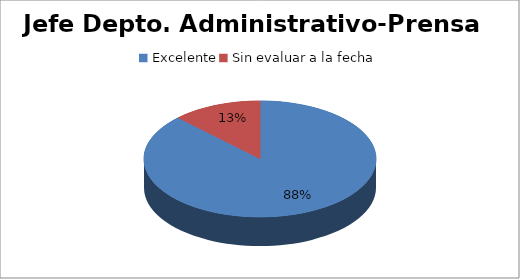
| Category | Cantidad |
|---|---|
| Excelente | 7 |
| Sin evaluar a la fecha | 1 |